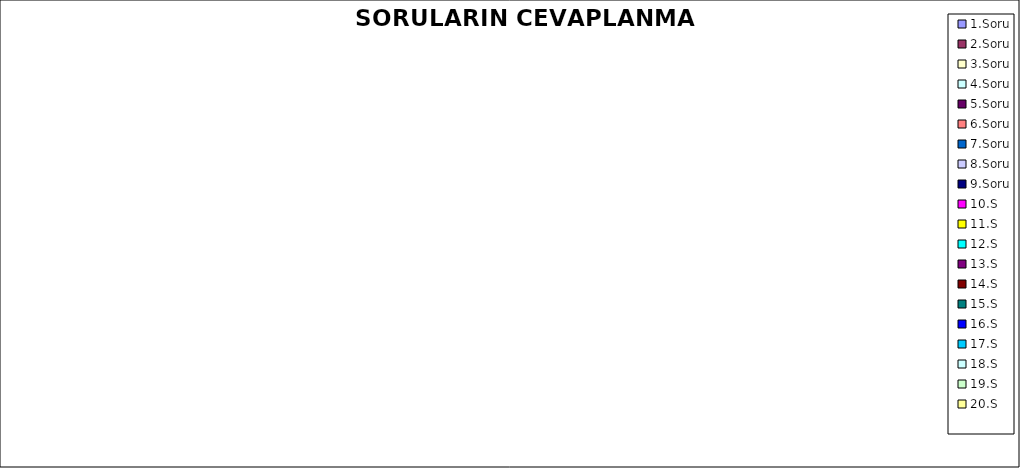
| Category | Series 0 |
|---|---|
| 1.Soru | 0 |
| 2.Soru | 0 |
| 3.Soru | 0 |
| 4.Soru | 0 |
| 5.Soru | 0 |
| 6.Soru | 0 |
| 7.Soru | 0 |
| 8.Soru | 0 |
| 9.Soru | 0 |
| 10.S | 0 |
| 11.S | 0 |
| 12.S | 0 |
| 13.S | 0 |
| 14.S | 0 |
| 15.S | 0 |
| 16.S | 0 |
| 17.S | 0 |
| 18.S | 0 |
| 19.S | 0 |
| 20.S | 0 |